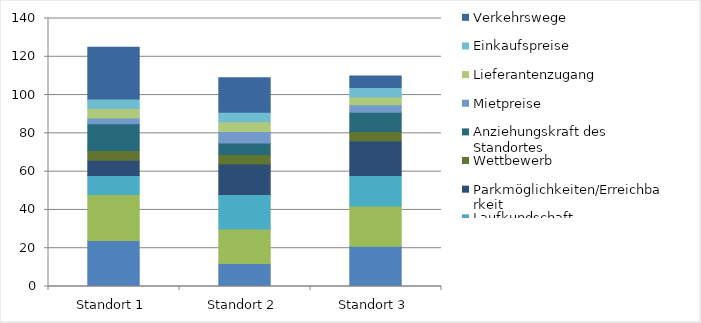
| Category | Einzugsgebiet | Kaufkraft | Laufkundschaft | Parkmöglichkeiten/Erreichbarkeit | Wettbewerb | Anziehungskraft des Standortes | Mietpreise | Lieferantenzugang | Einkaufspreise | Verkehrswege |
|---|---|---|---|---|---|---|---|---|---|---|
| Standort 1 | 24 | 24 | 10 | 8 | 5 | 14 | 3 | 5 | 5 | 27 |
| Standort 2 | 12 | 18 | 18 | 16 | 5 | 6 | 6 | 5 | 5 | 18 |
| Standort 3 | 21 | 21 | 16 | 18 | 5 | 10 | 4 | 4 | 5 | 6 |